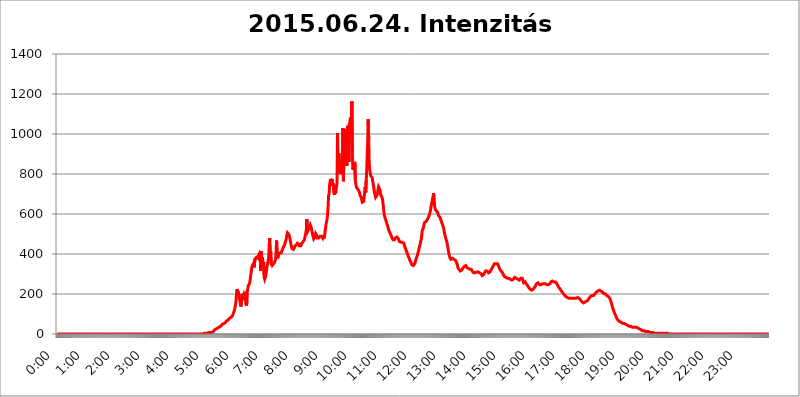
| Category | 2015.06.24. Intenzitás [W/m^2] |
|---|---|
| 0.0 | 0 |
| 0.0006944444444444445 | 0 |
| 0.001388888888888889 | 0 |
| 0.0020833333333333333 | 0 |
| 0.002777777777777778 | 0 |
| 0.003472222222222222 | 0 |
| 0.004166666666666667 | 0 |
| 0.004861111111111111 | 0 |
| 0.005555555555555556 | 0 |
| 0.0062499999999999995 | 0 |
| 0.006944444444444444 | 0 |
| 0.007638888888888889 | 0 |
| 0.008333333333333333 | 0 |
| 0.009027777777777779 | 0 |
| 0.009722222222222222 | 0 |
| 0.010416666666666666 | 0 |
| 0.011111111111111112 | 0 |
| 0.011805555555555555 | 0 |
| 0.012499999999999999 | 0 |
| 0.013194444444444444 | 0 |
| 0.013888888888888888 | 0 |
| 0.014583333333333332 | 0 |
| 0.015277777777777777 | 0 |
| 0.015972222222222224 | 0 |
| 0.016666666666666666 | 0 |
| 0.017361111111111112 | 0 |
| 0.018055555555555557 | 0 |
| 0.01875 | 0 |
| 0.019444444444444445 | 0 |
| 0.02013888888888889 | 0 |
| 0.020833333333333332 | 0 |
| 0.02152777777777778 | 0 |
| 0.022222222222222223 | 0 |
| 0.02291666666666667 | 0 |
| 0.02361111111111111 | 0 |
| 0.024305555555555556 | 0 |
| 0.024999999999999998 | 0 |
| 0.025694444444444447 | 0 |
| 0.02638888888888889 | 0 |
| 0.027083333333333334 | 0 |
| 0.027777777777777776 | 0 |
| 0.02847222222222222 | 0 |
| 0.029166666666666664 | 0 |
| 0.029861111111111113 | 0 |
| 0.030555555555555555 | 0 |
| 0.03125 | 0 |
| 0.03194444444444445 | 0 |
| 0.03263888888888889 | 0 |
| 0.03333333333333333 | 0 |
| 0.034027777777777775 | 0 |
| 0.034722222222222224 | 0 |
| 0.035416666666666666 | 0 |
| 0.036111111111111115 | 0 |
| 0.03680555555555556 | 0 |
| 0.0375 | 0 |
| 0.03819444444444444 | 0 |
| 0.03888888888888889 | 0 |
| 0.03958333333333333 | 0 |
| 0.04027777777777778 | 0 |
| 0.04097222222222222 | 0 |
| 0.041666666666666664 | 0 |
| 0.042361111111111106 | 0 |
| 0.04305555555555556 | 0 |
| 0.043750000000000004 | 0 |
| 0.044444444444444446 | 0 |
| 0.04513888888888889 | 0 |
| 0.04583333333333334 | 0 |
| 0.04652777777777778 | 0 |
| 0.04722222222222222 | 0 |
| 0.04791666666666666 | 0 |
| 0.04861111111111111 | 0 |
| 0.049305555555555554 | 0 |
| 0.049999999999999996 | 0 |
| 0.05069444444444445 | 0 |
| 0.051388888888888894 | 0 |
| 0.052083333333333336 | 0 |
| 0.05277777777777778 | 0 |
| 0.05347222222222222 | 0 |
| 0.05416666666666667 | 0 |
| 0.05486111111111111 | 0 |
| 0.05555555555555555 | 0 |
| 0.05625 | 0 |
| 0.05694444444444444 | 0 |
| 0.057638888888888885 | 0 |
| 0.05833333333333333 | 0 |
| 0.05902777777777778 | 0 |
| 0.059722222222222225 | 0 |
| 0.06041666666666667 | 0 |
| 0.061111111111111116 | 0 |
| 0.06180555555555556 | 0 |
| 0.0625 | 0 |
| 0.06319444444444444 | 0 |
| 0.06388888888888888 | 0 |
| 0.06458333333333334 | 0 |
| 0.06527777777777778 | 0 |
| 0.06597222222222222 | 0 |
| 0.06666666666666667 | 0 |
| 0.06736111111111111 | 0 |
| 0.06805555555555555 | 0 |
| 0.06874999999999999 | 0 |
| 0.06944444444444443 | 0 |
| 0.07013888888888889 | 0 |
| 0.07083333333333333 | 0 |
| 0.07152777777777779 | 0 |
| 0.07222222222222223 | 0 |
| 0.07291666666666667 | 0 |
| 0.07361111111111111 | 0 |
| 0.07430555555555556 | 0 |
| 0.075 | 0 |
| 0.07569444444444444 | 0 |
| 0.0763888888888889 | 0 |
| 0.07708333333333334 | 0 |
| 0.07777777777777778 | 0 |
| 0.07847222222222222 | 0 |
| 0.07916666666666666 | 0 |
| 0.0798611111111111 | 0 |
| 0.08055555555555556 | 0 |
| 0.08125 | 0 |
| 0.08194444444444444 | 0 |
| 0.08263888888888889 | 0 |
| 0.08333333333333333 | 0 |
| 0.08402777777777777 | 0 |
| 0.08472222222222221 | 0 |
| 0.08541666666666665 | 0 |
| 0.08611111111111112 | 0 |
| 0.08680555555555557 | 0 |
| 0.08750000000000001 | 0 |
| 0.08819444444444445 | 0 |
| 0.08888888888888889 | 0 |
| 0.08958333333333333 | 0 |
| 0.09027777777777778 | 0 |
| 0.09097222222222222 | 0 |
| 0.09166666666666667 | 0 |
| 0.09236111111111112 | 0 |
| 0.09305555555555556 | 0 |
| 0.09375 | 0 |
| 0.09444444444444444 | 0 |
| 0.09513888888888888 | 0 |
| 0.09583333333333333 | 0 |
| 0.09652777777777777 | 0 |
| 0.09722222222222222 | 0 |
| 0.09791666666666667 | 0 |
| 0.09861111111111111 | 0 |
| 0.09930555555555555 | 0 |
| 0.09999999999999999 | 0 |
| 0.10069444444444443 | 0 |
| 0.1013888888888889 | 0 |
| 0.10208333333333335 | 0 |
| 0.10277777777777779 | 0 |
| 0.10347222222222223 | 0 |
| 0.10416666666666667 | 0 |
| 0.10486111111111111 | 0 |
| 0.10555555555555556 | 0 |
| 0.10625 | 0 |
| 0.10694444444444444 | 0 |
| 0.1076388888888889 | 0 |
| 0.10833333333333334 | 0 |
| 0.10902777777777778 | 0 |
| 0.10972222222222222 | 0 |
| 0.1111111111111111 | 0 |
| 0.11180555555555556 | 0 |
| 0.11180555555555556 | 0 |
| 0.1125 | 0 |
| 0.11319444444444444 | 0 |
| 0.11388888888888889 | 0 |
| 0.11458333333333333 | 0 |
| 0.11527777777777777 | 0 |
| 0.11597222222222221 | 0 |
| 0.11666666666666665 | 0 |
| 0.1173611111111111 | 0 |
| 0.11805555555555557 | 0 |
| 0.11944444444444445 | 0 |
| 0.12013888888888889 | 0 |
| 0.12083333333333333 | 0 |
| 0.12152777777777778 | 0 |
| 0.12222222222222223 | 0 |
| 0.12291666666666667 | 0 |
| 0.12291666666666667 | 0 |
| 0.12361111111111112 | 0 |
| 0.12430555555555556 | 0 |
| 0.125 | 0 |
| 0.12569444444444444 | 0 |
| 0.12638888888888888 | 0 |
| 0.12708333333333333 | 0 |
| 0.16875 | 0 |
| 0.12847222222222224 | 0 |
| 0.12916666666666668 | 0 |
| 0.12986111111111112 | 0 |
| 0.13055555555555556 | 0 |
| 0.13125 | 0 |
| 0.13194444444444445 | 0 |
| 0.1326388888888889 | 0 |
| 0.13333333333333333 | 0 |
| 0.13402777777777777 | 0 |
| 0.13402777777777777 | 0 |
| 0.13472222222222222 | 0 |
| 0.13541666666666666 | 0 |
| 0.1361111111111111 | 0 |
| 0.13749999999999998 | 0 |
| 0.13819444444444443 | 0 |
| 0.1388888888888889 | 0 |
| 0.13958333333333334 | 0 |
| 0.14027777777777778 | 0 |
| 0.14097222222222222 | 0 |
| 0.14166666666666666 | 0 |
| 0.1423611111111111 | 0 |
| 0.14305555555555557 | 0 |
| 0.14375000000000002 | 0 |
| 0.14444444444444446 | 0 |
| 0.1451388888888889 | 0 |
| 0.1451388888888889 | 0 |
| 0.14652777777777778 | 0 |
| 0.14722222222222223 | 0 |
| 0.14791666666666667 | 0 |
| 0.1486111111111111 | 0 |
| 0.14930555555555555 | 0 |
| 0.15 | 0 |
| 0.15069444444444444 | 0 |
| 0.15138888888888888 | 0 |
| 0.15208333333333332 | 0 |
| 0.15277777777777776 | 0 |
| 0.15347222222222223 | 0 |
| 0.15416666666666667 | 0 |
| 0.15486111111111112 | 0 |
| 0.15555555555555556 | 0 |
| 0.15625 | 0 |
| 0.15694444444444444 | 0 |
| 0.15763888888888888 | 0 |
| 0.15833333333333333 | 0 |
| 0.15902777777777777 | 0 |
| 0.15972222222222224 | 0 |
| 0.16041666666666668 | 0 |
| 0.16111111111111112 | 0 |
| 0.16180555555555556 | 0 |
| 0.1625 | 0 |
| 0.16319444444444445 | 0 |
| 0.1638888888888889 | 0 |
| 0.16458333333333333 | 0 |
| 0.16527777777777777 | 0 |
| 0.16597222222222222 | 0 |
| 0.16666666666666666 | 0 |
| 0.1673611111111111 | 0 |
| 0.16805555555555554 | 0 |
| 0.16874999999999998 | 0 |
| 0.16944444444444443 | 0 |
| 0.17013888888888887 | 0 |
| 0.1708333333333333 | 0 |
| 0.17152777777777775 | 0 |
| 0.17222222222222225 | 0 |
| 0.1729166666666667 | 0 |
| 0.17361111111111113 | 0 |
| 0.17430555555555557 | 0 |
| 0.17500000000000002 | 0 |
| 0.17569444444444446 | 0 |
| 0.1763888888888889 | 0 |
| 0.17708333333333334 | 0 |
| 0.17777777777777778 | 0 |
| 0.17847222222222223 | 0 |
| 0.17916666666666667 | 0 |
| 0.1798611111111111 | 0 |
| 0.18055555555555555 | 0 |
| 0.18125 | 0 |
| 0.18194444444444444 | 0 |
| 0.1826388888888889 | 0 |
| 0.18333333333333335 | 0 |
| 0.1840277777777778 | 0 |
| 0.18472222222222223 | 0 |
| 0.18541666666666667 | 0 |
| 0.18611111111111112 | 0 |
| 0.18680555555555556 | 0 |
| 0.1875 | 0 |
| 0.18819444444444444 | 0 |
| 0.18888888888888888 | 0 |
| 0.18958333333333333 | 0 |
| 0.19027777777777777 | 0 |
| 0.1909722222222222 | 0 |
| 0.19166666666666665 | 0 |
| 0.19236111111111112 | 0 |
| 0.19305555555555554 | 0 |
| 0.19375 | 0 |
| 0.19444444444444445 | 0 |
| 0.1951388888888889 | 0 |
| 0.19583333333333333 | 0 |
| 0.19652777777777777 | 0 |
| 0.19722222222222222 | 0 |
| 0.19791666666666666 | 0 |
| 0.1986111111111111 | 0 |
| 0.19930555555555554 | 0 |
| 0.19999999999999998 | 0 |
| 0.20069444444444443 | 0 |
| 0.20138888888888887 | 0 |
| 0.2020833333333333 | 0 |
| 0.2027777777777778 | 0 |
| 0.2034722222222222 | 0 |
| 0.2041666666666667 | 0 |
| 0.20486111111111113 | 3.525 |
| 0.20555555555555557 | 3.525 |
| 0.20625000000000002 | 3.525 |
| 0.20694444444444446 | 3.525 |
| 0.2076388888888889 | 3.525 |
| 0.20833333333333334 | 3.525 |
| 0.20902777777777778 | 3.525 |
| 0.20972222222222223 | 3.525 |
| 0.21041666666666667 | 3.525 |
| 0.2111111111111111 | 3.525 |
| 0.21180555555555555 | 3.525 |
| 0.2125 | 7.887 |
| 0.21319444444444444 | 7.887 |
| 0.2138888888888889 | 7.887 |
| 0.21458333333333335 | 7.887 |
| 0.2152777777777778 | 7.887 |
| 0.21597222222222223 | 7.887 |
| 0.21666666666666667 | 7.887 |
| 0.21736111111111112 | 12.257 |
| 0.21805555555555556 | 12.257 |
| 0.21875 | 12.257 |
| 0.21944444444444444 | 12.257 |
| 0.22013888888888888 | 16.636 |
| 0.22083333333333333 | 21.024 |
| 0.22152777777777777 | 21.024 |
| 0.2222222222222222 | 21.024 |
| 0.22291666666666665 | 25.419 |
| 0.2236111111111111 | 25.419 |
| 0.22430555555555556 | 29.823 |
| 0.225 | 29.823 |
| 0.22569444444444445 | 29.823 |
| 0.2263888888888889 | 34.234 |
| 0.22708333333333333 | 34.234 |
| 0.22777777777777777 | 34.234 |
| 0.22847222222222222 | 38.653 |
| 0.22916666666666666 | 38.653 |
| 0.2298611111111111 | 43.079 |
| 0.23055555555555554 | 43.079 |
| 0.23124999999999998 | 47.511 |
| 0.23194444444444443 | 47.511 |
| 0.23263888888888887 | 47.511 |
| 0.2333333333333333 | 51.951 |
| 0.2340277777777778 | 51.951 |
| 0.2347222222222222 | 56.398 |
| 0.2354166666666667 | 56.398 |
| 0.23611111111111113 | 56.398 |
| 0.23680555555555557 | 60.85 |
| 0.23750000000000002 | 65.31 |
| 0.23819444444444446 | 65.31 |
| 0.2388888888888889 | 65.31 |
| 0.23958333333333334 | 69.775 |
| 0.24027777777777778 | 74.246 |
| 0.24097222222222223 | 74.246 |
| 0.24166666666666667 | 78.722 |
| 0.2423611111111111 | 78.722 |
| 0.24305555555555555 | 83.205 |
| 0.24375 | 83.205 |
| 0.24444444444444446 | 83.205 |
| 0.24513888888888888 | 87.692 |
| 0.24583333333333335 | 92.184 |
| 0.2465277777777778 | 96.682 |
| 0.24722222222222223 | 105.69 |
| 0.24791666666666667 | 110.201 |
| 0.24861111111111112 | 119.235 |
| 0.24930555555555556 | 132.814 |
| 0.25 | 146.423 |
| 0.25069444444444444 | 164.605 |
| 0.2513888888888889 | 196.497 |
| 0.2520833333333333 | 223.873 |
| 0.25277777777777777 | 219.309 |
| 0.2534722222222222 | 223.873 |
| 0.25416666666666665 | 205.62 |
| 0.2548611111111111 | 191.937 |
| 0.2555555555555556 | 178.264 |
| 0.25625000000000003 | 164.605 |
| 0.2569444444444445 | 150.964 |
| 0.2576388888888889 | 137.347 |
| 0.25833333333333336 | 164.605 |
| 0.2590277777777778 | 201.058 |
| 0.25972222222222224 | 191.937 |
| 0.2604166666666667 | 169.156 |
| 0.2611111111111111 | 187.378 |
| 0.26180555555555557 | 196.497 |
| 0.2625 | 187.378 |
| 0.26319444444444445 | 187.378 |
| 0.2638888888888889 | 196.497 |
| 0.26458333333333334 | 150.964 |
| 0.2652777777777778 | 141.884 |
| 0.2659722222222222 | 155.509 |
| 0.26666666666666666 | 214.746 |
| 0.2673611111111111 | 228.436 |
| 0.26805555555555555 | 242.127 |
| 0.26875 | 246.689 |
| 0.26944444444444443 | 251.251 |
| 0.2701388888888889 | 260.373 |
| 0.2708333333333333 | 278.603 |
| 0.27152777777777776 | 296.808 |
| 0.2722222222222222 | 314.98 |
| 0.27291666666666664 | 333.113 |
| 0.2736111111111111 | 342.162 |
| 0.2743055555555555 | 342.162 |
| 0.27499999999999997 | 346.682 |
| 0.27569444444444446 | 355.712 |
| 0.27638888888888885 | 333.113 |
| 0.27708333333333335 | 373.729 |
| 0.2777777777777778 | 378.224 |
| 0.27847222222222223 | 378.224 |
| 0.2791666666666667 | 382.715 |
| 0.2798611111111111 | 382.715 |
| 0.28055555555555556 | 387.202 |
| 0.28125 | 378.224 |
| 0.28194444444444444 | 391.685 |
| 0.2826388888888889 | 387.202 |
| 0.2833333333333333 | 400.638 |
| 0.28402777777777777 | 396.164 |
| 0.2847222222222222 | 373.729 |
| 0.28541666666666665 | 314.98 |
| 0.28611111111111115 | 414.035 |
| 0.28680555555555554 | 337.639 |
| 0.28750000000000003 | 382.715 |
| 0.2881944444444445 | 369.23 |
| 0.2888888888888889 | 346.682 |
| 0.28958333333333336 | 360.221 |
| 0.2902777777777778 | 283.156 |
| 0.29097222222222224 | 274.047 |
| 0.2916666666666667 | 278.603 |
| 0.2923611111111111 | 287.709 |
| 0.29305555555555557 | 305.898 |
| 0.29375 | 324.052 |
| 0.29444444444444445 | 342.162 |
| 0.2951388888888889 | 351.198 |
| 0.29583333333333334 | 369.23 |
| 0.2965277777777778 | 382.715 |
| 0.2972222222222222 | 378.224 |
| 0.29791666666666666 | 480.356 |
| 0.2986111111111111 | 400.638 |
| 0.29930555555555555 | 414.035 |
| 0.3 | 351.198 |
| 0.30069444444444443 | 346.682 |
| 0.3013888888888889 | 342.162 |
| 0.3020833333333333 | 342.162 |
| 0.30277777777777776 | 346.682 |
| 0.3034722222222222 | 351.198 |
| 0.30416666666666664 | 351.198 |
| 0.3048611111111111 | 360.221 |
| 0.3055555555555555 | 360.221 |
| 0.30624999999999997 | 373.729 |
| 0.3069444444444444 | 409.574 |
| 0.3076388888888889 | 467.187 |
| 0.30833333333333335 | 405.108 |
| 0.3090277777777778 | 378.224 |
| 0.30972222222222223 | 382.715 |
| 0.3104166666666667 | 396.164 |
| 0.3111111111111111 | 400.638 |
| 0.31180555555555556 | 405.108 |
| 0.3125 | 405.108 |
| 0.31319444444444444 | 400.638 |
| 0.3138888888888889 | 405.108 |
| 0.3145833333333333 | 409.574 |
| 0.31527777777777777 | 409.574 |
| 0.3159722222222222 | 422.943 |
| 0.31666666666666665 | 427.39 |
| 0.31736111111111115 | 436.27 |
| 0.31805555555555554 | 440.702 |
| 0.31875000000000003 | 445.129 |
| 0.3194444444444445 | 453.968 |
| 0.3201388888888889 | 462.786 |
| 0.32083333333333336 | 471.582 |
| 0.3215277777777778 | 480.356 |
| 0.32222222222222224 | 497.836 |
| 0.3229166666666667 | 506.542 |
| 0.3236111111111111 | 510.885 |
| 0.32430555555555557 | 506.542 |
| 0.325 | 497.836 |
| 0.32569444444444445 | 489.108 |
| 0.3263888888888889 | 475.972 |
| 0.32708333333333334 | 462.786 |
| 0.3277777777777778 | 449.551 |
| 0.3284722222222222 | 436.27 |
| 0.32916666666666666 | 427.39 |
| 0.3298611111111111 | 422.943 |
| 0.33055555555555555 | 422.943 |
| 0.33125 | 422.943 |
| 0.33194444444444443 | 427.39 |
| 0.3326388888888889 | 431.833 |
| 0.3333333333333333 | 440.702 |
| 0.3340277777777778 | 440.702 |
| 0.3347222222222222 | 445.129 |
| 0.3354166666666667 | 445.129 |
| 0.3361111111111111 | 449.551 |
| 0.3368055555555556 | 453.968 |
| 0.33749999999999997 | 458.38 |
| 0.33819444444444446 | 453.968 |
| 0.33888888888888885 | 449.551 |
| 0.33958333333333335 | 440.702 |
| 0.34027777777777773 | 436.27 |
| 0.34097222222222223 | 436.27 |
| 0.3416666666666666 | 440.702 |
| 0.3423611111111111 | 445.129 |
| 0.3430555555555555 | 453.968 |
| 0.34375 | 458.38 |
| 0.3444444444444445 | 458.38 |
| 0.3451388888888889 | 462.786 |
| 0.3458333333333334 | 467.187 |
| 0.34652777777777777 | 471.582 |
| 0.34722222222222227 | 480.356 |
| 0.34791666666666665 | 493.475 |
| 0.34861111111111115 | 506.542 |
| 0.34930555555555554 | 519.555 |
| 0.35000000000000003 | 575.299 |
| 0.3506944444444444 | 528.2 |
| 0.3513888888888889 | 515.223 |
| 0.3520833333333333 | 510.885 |
| 0.3527777777777778 | 515.223 |
| 0.3534722222222222 | 532.513 |
| 0.3541666666666667 | 536.82 |
| 0.3548611111111111 | 545.416 |
| 0.35555555555555557 | 541.121 |
| 0.35625 | 532.513 |
| 0.35694444444444445 | 519.555 |
| 0.3576388888888889 | 506.542 |
| 0.35833333333333334 | 493.475 |
| 0.3590277777777778 | 484.735 |
| 0.3597222222222222 | 475.972 |
| 0.36041666666666666 | 471.582 |
| 0.3611111111111111 | 475.972 |
| 0.36180555555555555 | 489.108 |
| 0.3625 | 502.192 |
| 0.36319444444444443 | 506.542 |
| 0.3638888888888889 | 493.475 |
| 0.3645833333333333 | 480.356 |
| 0.3652777777777778 | 475.972 |
| 0.3659722222222222 | 480.356 |
| 0.3666666666666667 | 480.356 |
| 0.3673611111111111 | 484.735 |
| 0.3680555555555556 | 484.735 |
| 0.36874999999999997 | 489.108 |
| 0.36944444444444446 | 489.108 |
| 0.37013888888888885 | 489.108 |
| 0.37083333333333335 | 489.108 |
| 0.37152777777777773 | 489.108 |
| 0.37222222222222223 | 480.356 |
| 0.3729166666666666 | 489.108 |
| 0.3736111111111111 | 475.972 |
| 0.3743055555555555 | 480.356 |
| 0.375 | 493.475 |
| 0.3756944444444445 | 515.223 |
| 0.3763888888888889 | 532.513 |
| 0.3770833333333334 | 549.704 |
| 0.37777777777777777 | 562.53 |
| 0.37847222222222227 | 575.299 |
| 0.37916666666666665 | 600.661 |
| 0.37986111111111115 | 634.105 |
| 0.38055555555555554 | 691.608 |
| 0.38125000000000003 | 699.717 |
| 0.3819444444444444 | 743.859 |
| 0.3826388888888889 | 747.834 |
| 0.3833333333333333 | 775.492 |
| 0.3840277777777778 | 759.723 |
| 0.3847222222222222 | 739.877 |
| 0.3854166666666667 | 775.492 |
| 0.3861111111111111 | 755.766 |
| 0.38680555555555557 | 739.877 |
| 0.3875 | 751.803 |
| 0.38819444444444445 | 703.762 |
| 0.3888888888888889 | 695.666 |
| 0.38958333333333334 | 731.896 |
| 0.3902777777777778 | 703.762 |
| 0.3909722222222222 | 719.877 |
| 0.39166666666666666 | 735.89 |
| 0.3923611111111111 | 751.803 |
| 0.39305555555555555 | 1003.65 |
| 0.39375 | 806.757 |
| 0.39444444444444443 | 864.493 |
| 0.3951388888888889 | 902.447 |
| 0.3958333333333333 | 841.526 |
| 0.3965277777777778 | 798.974 |
| 0.3972222222222222 | 795.074 |
| 0.3979166666666667 | 818.392 |
| 0.3986111111111111 | 822.26 |
| 0.3993055555555556 | 837.682 |
| 0.39999999999999997 | 810.641 |
| 0.40069444444444446 | 1029.798 |
| 0.40138888888888885 | 763.674 |
| 0.40208333333333335 | 902.447 |
| 0.40277777777777773 | 1022.323 |
| 0.40347222222222223 | 1014.852 |
| 0.4041666666666666 | 988.714 |
| 0.4048611111111111 | 955.071 |
| 0.4055555555555555 | 868.305 |
| 0.40625 | 841.526 |
| 0.4069444444444445 | 1029.798 |
| 0.4076388888888889 | 1041.019 |
| 0.4083333333333334 | 973.772 |
| 0.40902777777777777 | 860.676 |
| 0.40972222222222227 | 1048.508 |
| 0.41041666666666665 | 1056.004 |
| 0.41111111111111115 | 1082.324 |
| 0.41180555555555554 | 1063.51 |
| 0.41250000000000003 | 992.448 |
| 0.4131944444444444 | 1162.571 |
| 0.4138888888888889 | 909.996 |
| 0.4145833333333333 | 822.26 |
| 0.4152777777777778 | 833.834 |
| 0.4159722222222222 | 822.26 |
| 0.4166666666666667 | 845.365 |
| 0.4173611111111111 | 860.676 |
| 0.41805555555555557 | 767.62 |
| 0.41875 | 751.803 |
| 0.41944444444444445 | 735.89 |
| 0.4201388888888889 | 731.896 |
| 0.42083333333333334 | 727.896 |
| 0.4215277777777778 | 723.889 |
| 0.4222222222222222 | 719.877 |
| 0.42291666666666666 | 719.877 |
| 0.4236111111111111 | 711.832 |
| 0.42430555555555555 | 699.717 |
| 0.425 | 691.608 |
| 0.42569444444444443 | 687.544 |
| 0.4263888888888889 | 683.473 |
| 0.4270833333333333 | 671.22 |
| 0.4277777777777778 | 658.909 |
| 0.4284722222222222 | 654.791 |
| 0.4291666666666667 | 658.909 |
| 0.4298611111111111 | 663.019 |
| 0.4305555555555556 | 687.544 |
| 0.43124999999999997 | 687.544 |
| 0.43194444444444446 | 735.89 |
| 0.43263888888888885 | 707.8 |
| 0.43333333333333335 | 767.62 |
| 0.43402777777777773 | 814.519 |
| 0.43472222222222223 | 894.885 |
| 0.4354166666666666 | 970.034 |
| 0.4361111111111111 | 1074.789 |
| 0.4368055555555555 | 981.244 |
| 0.4375 | 856.855 |
| 0.4381944444444445 | 822.26 |
| 0.4388888888888889 | 806.757 |
| 0.4395833333333334 | 791.169 |
| 0.44027777777777777 | 787.258 |
| 0.44097222222222227 | 787.258 |
| 0.44166666666666665 | 783.342 |
| 0.44236111111111115 | 767.62 |
| 0.44305555555555554 | 751.803 |
| 0.44375000000000003 | 735.89 |
| 0.4444444444444444 | 719.877 |
| 0.4451388888888889 | 703.762 |
| 0.4458333333333333 | 691.608 |
| 0.4465277777777778 | 683.473 |
| 0.4472222222222222 | 679.395 |
| 0.4479166666666667 | 683.473 |
| 0.4486111111111111 | 695.666 |
| 0.44930555555555557 | 707.8 |
| 0.45 | 723.889 |
| 0.45069444444444445 | 735.89 |
| 0.4513888888888889 | 739.877 |
| 0.45208333333333334 | 735.89 |
| 0.4527777777777778 | 719.877 |
| 0.4534722222222222 | 699.717 |
| 0.45416666666666666 | 691.608 |
| 0.4548611111111111 | 691.608 |
| 0.45555555555555555 | 683.473 |
| 0.45625 | 671.22 |
| 0.45694444444444443 | 650.667 |
| 0.4576388888888889 | 625.784 |
| 0.4583333333333333 | 604.864 |
| 0.4590277777777778 | 592.233 |
| 0.4597222222222222 | 579.542 |
| 0.4604166666666667 | 575.299 |
| 0.4611111111111111 | 566.793 |
| 0.4618055555555556 | 558.261 |
| 0.46249999999999997 | 549.704 |
| 0.46319444444444446 | 541.121 |
| 0.46388888888888885 | 532.513 |
| 0.46458333333333335 | 523.88 |
| 0.46527777777777773 | 515.223 |
| 0.46597222222222223 | 510.885 |
| 0.4666666666666666 | 506.542 |
| 0.4673611111111111 | 497.836 |
| 0.4680555555555555 | 493.475 |
| 0.46875 | 489.108 |
| 0.4694444444444445 | 480.356 |
| 0.4701388888888889 | 475.972 |
| 0.4708333333333334 | 471.582 |
| 0.47152777777777777 | 467.187 |
| 0.47222222222222227 | 467.187 |
| 0.47291666666666665 | 471.582 |
| 0.47361111111111115 | 471.582 |
| 0.47430555555555554 | 480.356 |
| 0.47500000000000003 | 484.735 |
| 0.4756944444444444 | 484.735 |
| 0.4763888888888889 | 484.735 |
| 0.4770833333333333 | 484.735 |
| 0.4777777777777778 | 480.356 |
| 0.4784722222222222 | 475.972 |
| 0.4791666666666667 | 471.582 |
| 0.4798611111111111 | 462.786 |
| 0.48055555555555557 | 458.38 |
| 0.48125 | 458.38 |
| 0.48194444444444445 | 458.38 |
| 0.4826388888888889 | 458.38 |
| 0.48333333333333334 | 458.38 |
| 0.4840277777777778 | 458.38 |
| 0.4847222222222222 | 453.968 |
| 0.48541666666666666 | 453.968 |
| 0.4861111111111111 | 453.968 |
| 0.48680555555555555 | 445.129 |
| 0.4875 | 436.27 |
| 0.48819444444444443 | 431.833 |
| 0.4888888888888889 | 422.943 |
| 0.4895833333333333 | 418.492 |
| 0.4902777777777778 | 409.574 |
| 0.4909722222222222 | 405.108 |
| 0.4916666666666667 | 396.164 |
| 0.4923611111111111 | 387.202 |
| 0.4930555555555556 | 382.715 |
| 0.49374999999999997 | 378.224 |
| 0.49444444444444446 | 369.23 |
| 0.49513888888888885 | 369.23 |
| 0.49583333333333335 | 360.221 |
| 0.49652777777777773 | 355.712 |
| 0.49722222222222223 | 346.682 |
| 0.4979166666666666 | 342.162 |
| 0.4986111111111111 | 342.162 |
| 0.4993055555555555 | 342.162 |
| 0.5 | 342.162 |
| 0.5006944444444444 | 342.162 |
| 0.5013888888888889 | 351.198 |
| 0.5020833333333333 | 360.221 |
| 0.5027777777777778 | 364.728 |
| 0.5034722222222222 | 378.224 |
| 0.5041666666666667 | 382.715 |
| 0.5048611111111111 | 391.685 |
| 0.5055555555555555 | 400.638 |
| 0.50625 | 409.574 |
| 0.5069444444444444 | 418.492 |
| 0.5076388888888889 | 431.833 |
| 0.5083333333333333 | 440.702 |
| 0.5090277777777777 | 449.551 |
| 0.5097222222222222 | 462.786 |
| 0.5104166666666666 | 471.582 |
| 0.5111111111111112 | 489.108 |
| 0.5118055555555555 | 515.223 |
| 0.5125000000000001 | 519.555 |
| 0.5131944444444444 | 528.2 |
| 0.513888888888889 | 536.82 |
| 0.5145833333333333 | 549.704 |
| 0.5152777777777778 | 558.261 |
| 0.5159722222222222 | 558.261 |
| 0.5166666666666667 | 558.261 |
| 0.517361111111111 | 562.53 |
| 0.5180555555555556 | 566.793 |
| 0.5187499999999999 | 571.049 |
| 0.5194444444444445 | 575.299 |
| 0.5201388888888888 | 579.542 |
| 0.5208333333333334 | 583.779 |
| 0.5215277777777778 | 592.233 |
| 0.5222222222222223 | 596.45 |
| 0.5229166666666667 | 609.062 |
| 0.5236111111111111 | 621.613 |
| 0.5243055555555556 | 638.256 |
| 0.525 | 650.667 |
| 0.5256944444444445 | 663.019 |
| 0.5263888888888889 | 675.311 |
| 0.5270833333333333 | 687.544 |
| 0.5277777777777778 | 703.762 |
| 0.5284722222222222 | 687.544 |
| 0.5291666666666667 | 646.537 |
| 0.5298611111111111 | 625.784 |
| 0.5305555555555556 | 621.613 |
| 0.53125 | 617.436 |
| 0.5319444444444444 | 613.252 |
| 0.5326388888888889 | 613.252 |
| 0.5333333333333333 | 609.062 |
| 0.5340277777777778 | 600.661 |
| 0.5347222222222222 | 592.233 |
| 0.5354166666666667 | 588.009 |
| 0.5361111111111111 | 588.009 |
| 0.5368055555555555 | 583.779 |
| 0.5375 | 575.299 |
| 0.5381944444444444 | 571.049 |
| 0.5388888888888889 | 562.53 |
| 0.5395833333333333 | 553.986 |
| 0.5402777777777777 | 549.704 |
| 0.5409722222222222 | 541.121 |
| 0.5416666666666666 | 532.513 |
| 0.5423611111111112 | 519.555 |
| 0.5430555555555555 | 506.542 |
| 0.5437500000000001 | 493.475 |
| 0.5444444444444444 | 484.735 |
| 0.545138888888889 | 475.972 |
| 0.5458333333333333 | 467.187 |
| 0.5465277777777778 | 458.38 |
| 0.5472222222222222 | 445.129 |
| 0.5479166666666667 | 431.833 |
| 0.548611111111111 | 414.035 |
| 0.5493055555555556 | 400.638 |
| 0.5499999999999999 | 391.685 |
| 0.5506944444444445 | 382.715 |
| 0.5513888888888888 | 378.224 |
| 0.5520833333333334 | 373.729 |
| 0.5527777777777778 | 378.224 |
| 0.5534722222222223 | 378.224 |
| 0.5541666666666667 | 378.224 |
| 0.5548611111111111 | 378.224 |
| 0.5555555555555556 | 373.729 |
| 0.55625 | 373.729 |
| 0.5569444444444445 | 373.729 |
| 0.5576388888888889 | 373.729 |
| 0.5583333333333333 | 369.23 |
| 0.5590277777777778 | 364.728 |
| 0.5597222222222222 | 360.221 |
| 0.5604166666666667 | 355.712 |
| 0.5611111111111111 | 346.682 |
| 0.5618055555555556 | 333.113 |
| 0.5625 | 328.584 |
| 0.5631944444444444 | 324.052 |
| 0.5638888888888889 | 319.517 |
| 0.5645833333333333 | 319.517 |
| 0.5652777777777778 | 314.98 |
| 0.5659722222222222 | 314.98 |
| 0.5666666666666667 | 319.517 |
| 0.5673611111111111 | 319.517 |
| 0.5680555555555555 | 324.052 |
| 0.56875 | 328.584 |
| 0.5694444444444444 | 333.113 |
| 0.5701388888888889 | 333.113 |
| 0.5708333333333333 | 337.639 |
| 0.5715277777777777 | 342.162 |
| 0.5722222222222222 | 342.162 |
| 0.5729166666666666 | 342.162 |
| 0.5736111111111112 | 337.639 |
| 0.5743055555555555 | 333.113 |
| 0.5750000000000001 | 333.113 |
| 0.5756944444444444 | 333.113 |
| 0.576388888888889 | 328.584 |
| 0.5770833333333333 | 324.052 |
| 0.5777777777777778 | 324.052 |
| 0.5784722222222222 | 324.052 |
| 0.5791666666666667 | 324.052 |
| 0.579861111111111 | 324.052 |
| 0.5805555555555556 | 324.052 |
| 0.5812499999999999 | 319.517 |
| 0.5819444444444445 | 314.98 |
| 0.5826388888888888 | 310.44 |
| 0.5833333333333334 | 310.44 |
| 0.5840277777777778 | 305.898 |
| 0.5847222222222223 | 305.898 |
| 0.5854166666666667 | 305.898 |
| 0.5861111111111111 | 305.898 |
| 0.5868055555555556 | 305.898 |
| 0.5875 | 305.898 |
| 0.5881944444444445 | 310.44 |
| 0.5888888888888889 | 310.44 |
| 0.5895833333333333 | 310.44 |
| 0.5902777777777778 | 310.44 |
| 0.5909722222222222 | 310.44 |
| 0.5916666666666667 | 310.44 |
| 0.5923611111111111 | 305.898 |
| 0.5930555555555556 | 305.898 |
| 0.59375 | 305.898 |
| 0.5944444444444444 | 301.354 |
| 0.5951388888888889 | 296.808 |
| 0.5958333333333333 | 292.259 |
| 0.5965277777777778 | 292.259 |
| 0.5972222222222222 | 296.808 |
| 0.5979166666666667 | 296.808 |
| 0.5986111111111111 | 296.808 |
| 0.5993055555555555 | 305.898 |
| 0.6 | 310.44 |
| 0.6006944444444444 | 314.98 |
| 0.6013888888888889 | 319.517 |
| 0.6020833333333333 | 319.517 |
| 0.6027777777777777 | 314.98 |
| 0.6034722222222222 | 310.44 |
| 0.6041666666666666 | 310.44 |
| 0.6048611111111112 | 305.898 |
| 0.6055555555555555 | 310.44 |
| 0.6062500000000001 | 310.44 |
| 0.6069444444444444 | 310.44 |
| 0.607638888888889 | 314.98 |
| 0.6083333333333333 | 319.517 |
| 0.6090277777777778 | 324.052 |
| 0.6097222222222222 | 324.052 |
| 0.6104166666666667 | 333.113 |
| 0.611111111111111 | 337.639 |
| 0.6118055555555556 | 342.162 |
| 0.6124999999999999 | 346.682 |
| 0.6131944444444445 | 351.198 |
| 0.6138888888888888 | 351.198 |
| 0.6145833333333334 | 355.712 |
| 0.6152777777777778 | 351.198 |
| 0.6159722222222223 | 351.198 |
| 0.6166666666666667 | 351.198 |
| 0.6173611111111111 | 351.198 |
| 0.6180555555555556 | 346.682 |
| 0.61875 | 342.162 |
| 0.6194444444444445 | 337.639 |
| 0.6201388888888889 | 328.584 |
| 0.6208333333333333 | 324.052 |
| 0.6215277777777778 | 319.517 |
| 0.6222222222222222 | 314.98 |
| 0.6229166666666667 | 314.98 |
| 0.6236111111111111 | 310.44 |
| 0.6243055555555556 | 305.898 |
| 0.625 | 305.898 |
| 0.6256944444444444 | 296.808 |
| 0.6263888888888889 | 292.259 |
| 0.6270833333333333 | 287.709 |
| 0.6277777777777778 | 283.156 |
| 0.6284722222222222 | 283.156 |
| 0.6291666666666667 | 283.156 |
| 0.6298611111111111 | 278.603 |
| 0.6305555555555555 | 278.603 |
| 0.63125 | 278.603 |
| 0.6319444444444444 | 278.603 |
| 0.6326388888888889 | 278.603 |
| 0.6333333333333333 | 278.603 |
| 0.6340277777777777 | 278.603 |
| 0.6347222222222222 | 274.047 |
| 0.6354166666666666 | 274.047 |
| 0.6361111111111112 | 269.49 |
| 0.6368055555555555 | 269.49 |
| 0.6375000000000001 | 269.49 |
| 0.6381944444444444 | 269.49 |
| 0.638888888888889 | 269.49 |
| 0.6395833333333333 | 274.047 |
| 0.6402777777777778 | 278.603 |
| 0.6409722222222222 | 278.603 |
| 0.6416666666666667 | 283.156 |
| 0.642361111111111 | 283.156 |
| 0.6430555555555556 | 278.603 |
| 0.6437499999999999 | 278.603 |
| 0.6444444444444445 | 278.603 |
| 0.6451388888888888 | 274.047 |
| 0.6458333333333334 | 274.047 |
| 0.6465277777777778 | 274.047 |
| 0.6472222222222223 | 269.49 |
| 0.6479166666666667 | 269.49 |
| 0.6486111111111111 | 264.932 |
| 0.6493055555555556 | 269.49 |
| 0.65 | 278.603 |
| 0.6506944444444445 | 283.156 |
| 0.6513888888888889 | 283.156 |
| 0.6520833333333333 | 278.603 |
| 0.6527777777777778 | 274.047 |
| 0.6534722222222222 | 264.932 |
| 0.6541666666666667 | 255.813 |
| 0.6548611111111111 | 255.813 |
| 0.6555555555555556 | 255.813 |
| 0.65625 | 260.373 |
| 0.6569444444444444 | 255.813 |
| 0.6576388888888889 | 251.251 |
| 0.6583333333333333 | 246.689 |
| 0.6590277777777778 | 246.689 |
| 0.6597222222222222 | 242.127 |
| 0.6604166666666667 | 237.564 |
| 0.6611111111111111 | 233 |
| 0.6618055555555555 | 228.436 |
| 0.6625 | 228.436 |
| 0.6631944444444444 | 223.873 |
| 0.6638888888888889 | 219.309 |
| 0.6645833333333333 | 219.309 |
| 0.6652777777777777 | 219.309 |
| 0.6659722222222222 | 219.309 |
| 0.6666666666666666 | 219.309 |
| 0.6673611111111111 | 223.873 |
| 0.6680555555555556 | 223.873 |
| 0.6687500000000001 | 228.436 |
| 0.6694444444444444 | 233 |
| 0.6701388888888888 | 237.564 |
| 0.6708333333333334 | 242.127 |
| 0.6715277777777778 | 246.689 |
| 0.6722222222222222 | 251.251 |
| 0.6729166666666666 | 255.813 |
| 0.6736111111111112 | 255.813 |
| 0.6743055555555556 | 255.813 |
| 0.6749999999999999 | 251.251 |
| 0.6756944444444444 | 251.251 |
| 0.6763888888888889 | 246.689 |
| 0.6770833333333334 | 246.689 |
| 0.6777777777777777 | 246.689 |
| 0.6784722222222223 | 246.689 |
| 0.6791666666666667 | 246.689 |
| 0.6798611111111111 | 251.251 |
| 0.6805555555555555 | 251.251 |
| 0.68125 | 251.251 |
| 0.6819444444444445 | 251.251 |
| 0.6826388888888889 | 251.251 |
| 0.6833333333333332 | 251.251 |
| 0.6840277777777778 | 251.251 |
| 0.6847222222222222 | 251.251 |
| 0.6854166666666667 | 251.251 |
| 0.686111111111111 | 251.251 |
| 0.6868055555555556 | 246.689 |
| 0.6875 | 246.689 |
| 0.6881944444444444 | 246.689 |
| 0.688888888888889 | 246.689 |
| 0.6895833333333333 | 246.689 |
| 0.6902777777777778 | 251.251 |
| 0.6909722222222222 | 251.251 |
| 0.6916666666666668 | 255.813 |
| 0.6923611111111111 | 260.373 |
| 0.6930555555555555 | 260.373 |
| 0.69375 | 260.373 |
| 0.6944444444444445 | 264.932 |
| 0.6951388888888889 | 264.932 |
| 0.6958333333333333 | 264.932 |
| 0.6965277777777777 | 260.373 |
| 0.6972222222222223 | 260.373 |
| 0.6979166666666666 | 260.373 |
| 0.6986111111111111 | 260.373 |
| 0.6993055555555556 | 255.813 |
| 0.7000000000000001 | 255.813 |
| 0.7006944444444444 | 251.251 |
| 0.7013888888888888 | 246.689 |
| 0.7020833333333334 | 242.127 |
| 0.7027777777777778 | 237.564 |
| 0.7034722222222222 | 233 |
| 0.7041666666666666 | 228.436 |
| 0.7048611111111112 | 228.436 |
| 0.7055555555555556 | 223.873 |
| 0.7062499999999999 | 219.309 |
| 0.7069444444444444 | 214.746 |
| 0.7076388888888889 | 210.182 |
| 0.7083333333333334 | 210.182 |
| 0.7090277777777777 | 205.62 |
| 0.7097222222222223 | 201.058 |
| 0.7104166666666667 | 201.058 |
| 0.7111111111111111 | 196.497 |
| 0.7118055555555555 | 191.937 |
| 0.7125 | 191.937 |
| 0.7131944444444445 | 187.378 |
| 0.7138888888888889 | 187.378 |
| 0.7145833333333332 | 182.82 |
| 0.7152777777777778 | 182.82 |
| 0.7159722222222222 | 178.264 |
| 0.7166666666666667 | 178.264 |
| 0.717361111111111 | 178.264 |
| 0.7180555555555556 | 178.264 |
| 0.71875 | 182.82 |
| 0.7194444444444444 | 178.264 |
| 0.720138888888889 | 178.264 |
| 0.7208333333333333 | 178.264 |
| 0.7215277777777778 | 178.264 |
| 0.7222222222222222 | 178.264 |
| 0.7229166666666668 | 178.264 |
| 0.7236111111111111 | 178.264 |
| 0.7243055555555555 | 178.264 |
| 0.725 | 178.264 |
| 0.7256944444444445 | 178.264 |
| 0.7263888888888889 | 173.709 |
| 0.7270833333333333 | 178.264 |
| 0.7277777777777777 | 178.264 |
| 0.7284722222222223 | 178.264 |
| 0.7291666666666666 | 178.264 |
| 0.7298611111111111 | 182.82 |
| 0.7305555555555556 | 178.264 |
| 0.7312500000000001 | 178.264 |
| 0.7319444444444444 | 178.264 |
| 0.7326388888888888 | 173.709 |
| 0.7333333333333334 | 173.709 |
| 0.7340277777777778 | 169.156 |
| 0.7347222222222222 | 164.605 |
| 0.7354166666666666 | 164.605 |
| 0.7361111111111112 | 160.056 |
| 0.7368055555555556 | 160.056 |
| 0.7374999999999999 | 155.509 |
| 0.7381944444444444 | 155.509 |
| 0.7388888888888889 | 155.509 |
| 0.7395833333333334 | 155.509 |
| 0.7402777777777777 | 160.056 |
| 0.7409722222222223 | 160.056 |
| 0.7416666666666667 | 160.056 |
| 0.7423611111111111 | 164.605 |
| 0.7430555555555555 | 164.605 |
| 0.74375 | 169.156 |
| 0.7444444444444445 | 169.156 |
| 0.7451388888888889 | 173.709 |
| 0.7458333333333332 | 178.264 |
| 0.7465277777777778 | 182.82 |
| 0.7472222222222222 | 182.82 |
| 0.7479166666666667 | 187.378 |
| 0.748611111111111 | 187.378 |
| 0.7493055555555556 | 187.378 |
| 0.75 | 191.937 |
| 0.7506944444444444 | 191.937 |
| 0.751388888888889 | 191.937 |
| 0.7520833333333333 | 191.937 |
| 0.7527777777777778 | 196.497 |
| 0.7534722222222222 | 196.497 |
| 0.7541666666666668 | 201.058 |
| 0.7548611111111111 | 201.058 |
| 0.7555555555555555 | 205.62 |
| 0.75625 | 210.182 |
| 0.7569444444444445 | 210.182 |
| 0.7576388888888889 | 214.746 |
| 0.7583333333333333 | 214.746 |
| 0.7590277777777777 | 219.309 |
| 0.7597222222222223 | 219.309 |
| 0.7604166666666666 | 219.309 |
| 0.7611111111111111 | 219.309 |
| 0.7618055555555556 | 219.309 |
| 0.7625000000000001 | 214.746 |
| 0.7631944444444444 | 214.746 |
| 0.7638888888888888 | 210.182 |
| 0.7645833333333334 | 210.182 |
| 0.7652777777777778 | 205.62 |
| 0.7659722222222222 | 205.62 |
| 0.7666666666666666 | 201.058 |
| 0.7673611111111112 | 201.058 |
| 0.7680555555555556 | 201.058 |
| 0.7687499999999999 | 201.058 |
| 0.7694444444444444 | 196.497 |
| 0.7701388888888889 | 196.497 |
| 0.7708333333333334 | 191.937 |
| 0.7715277777777777 | 191.937 |
| 0.7722222222222223 | 187.378 |
| 0.7729166666666667 | 187.378 |
| 0.7736111111111111 | 187.378 |
| 0.7743055555555555 | 182.82 |
| 0.775 | 178.264 |
| 0.7756944444444445 | 173.709 |
| 0.7763888888888889 | 164.605 |
| 0.7770833333333332 | 155.509 |
| 0.7777777777777778 | 146.423 |
| 0.7784722222222222 | 137.347 |
| 0.7791666666666667 | 128.284 |
| 0.779861111111111 | 123.758 |
| 0.7805555555555556 | 114.716 |
| 0.78125 | 110.201 |
| 0.7819444444444444 | 101.184 |
| 0.782638888888889 | 96.682 |
| 0.7833333333333333 | 92.184 |
| 0.7840277777777778 | 83.205 |
| 0.7847222222222222 | 78.722 |
| 0.7854166666666668 | 74.246 |
| 0.7861111111111111 | 69.775 |
| 0.7868055555555555 | 69.775 |
| 0.7875 | 65.31 |
| 0.7881944444444445 | 60.85 |
| 0.7888888888888889 | 60.85 |
| 0.7895833333333333 | 60.85 |
| 0.7902777777777777 | 60.85 |
| 0.7909722222222223 | 56.398 |
| 0.7916666666666666 | 56.398 |
| 0.7923611111111111 | 56.398 |
| 0.7930555555555556 | 56.398 |
| 0.7937500000000001 | 51.951 |
| 0.7944444444444444 | 51.951 |
| 0.7951388888888888 | 51.951 |
| 0.7958333333333334 | 51.951 |
| 0.7965277777777778 | 47.511 |
| 0.7972222222222222 | 47.511 |
| 0.7979166666666666 | 47.511 |
| 0.7986111111111112 | 47.511 |
| 0.7993055555555556 | 43.079 |
| 0.7999999999999999 | 43.079 |
| 0.8006944444444444 | 43.079 |
| 0.8013888888888889 | 38.653 |
| 0.8020833333333334 | 38.653 |
| 0.8027777777777777 | 38.653 |
| 0.8034722222222223 | 38.653 |
| 0.8041666666666667 | 38.653 |
| 0.8048611111111111 | 34.234 |
| 0.8055555555555555 | 34.234 |
| 0.80625 | 34.234 |
| 0.8069444444444445 | 34.234 |
| 0.8076388888888889 | 38.653 |
| 0.8083333333333332 | 34.234 |
| 0.8090277777777778 | 34.234 |
| 0.8097222222222222 | 34.234 |
| 0.8104166666666667 | 34.234 |
| 0.811111111111111 | 34.234 |
| 0.8118055555555556 | 34.234 |
| 0.8125 | 34.234 |
| 0.8131944444444444 | 34.234 |
| 0.813888888888889 | 29.823 |
| 0.8145833333333333 | 29.823 |
| 0.8152777777777778 | 29.823 |
| 0.8159722222222222 | 25.419 |
| 0.8166666666666668 | 25.419 |
| 0.8173611111111111 | 21.024 |
| 0.8180555555555555 | 21.024 |
| 0.81875 | 21.024 |
| 0.8194444444444445 | 21.024 |
| 0.8201388888888889 | 21.024 |
| 0.8208333333333333 | 16.636 |
| 0.8215277777777777 | 16.636 |
| 0.8222222222222223 | 16.636 |
| 0.8229166666666666 | 16.636 |
| 0.8236111111111111 | 16.636 |
| 0.8243055555555556 | 16.636 |
| 0.8250000000000001 | 12.257 |
| 0.8256944444444444 | 12.257 |
| 0.8263888888888888 | 12.257 |
| 0.8270833333333334 | 12.257 |
| 0.8277777777777778 | 12.257 |
| 0.8284722222222222 | 12.257 |
| 0.8291666666666666 | 12.257 |
| 0.8298611111111112 | 12.257 |
| 0.8305555555555556 | 7.887 |
| 0.8312499999999999 | 7.887 |
| 0.8319444444444444 | 7.887 |
| 0.8326388888888889 | 7.887 |
| 0.8333333333333334 | 7.887 |
| 0.8340277777777777 | 7.887 |
| 0.8347222222222223 | 7.887 |
| 0.8354166666666667 | 7.887 |
| 0.8361111111111111 | 7.887 |
| 0.8368055555555555 | 7.887 |
| 0.8375 | 3.525 |
| 0.8381944444444445 | 7.887 |
| 0.8388888888888889 | 3.525 |
| 0.8395833333333332 | 3.525 |
| 0.8402777777777778 | 3.525 |
| 0.8409722222222222 | 3.525 |
| 0.8416666666666667 | 3.525 |
| 0.842361111111111 | 3.525 |
| 0.8430555555555556 | 3.525 |
| 0.84375 | 3.525 |
| 0.8444444444444444 | 3.525 |
| 0.845138888888889 | 3.525 |
| 0.8458333333333333 | 3.525 |
| 0.8465277777777778 | 3.525 |
| 0.8472222222222222 | 3.525 |
| 0.8479166666666668 | 3.525 |
| 0.8486111111111111 | 3.525 |
| 0.8493055555555555 | 3.525 |
| 0.85 | 3.525 |
| 0.8506944444444445 | 3.525 |
| 0.8513888888888889 | 3.525 |
| 0.8520833333333333 | 3.525 |
| 0.8527777777777777 | 3.525 |
| 0.8534722222222223 | 3.525 |
| 0.8541666666666666 | 3.525 |
| 0.8548611111111111 | 3.525 |
| 0.8555555555555556 | 3.525 |
| 0.8562500000000001 | 3.525 |
| 0.8569444444444444 | 3.525 |
| 0.8576388888888888 | 0 |
| 0.8583333333333334 | 0 |
| 0.8590277777777778 | 0 |
| 0.8597222222222222 | 0 |
| 0.8604166666666666 | 0 |
| 0.8611111111111112 | 0 |
| 0.8618055555555556 | 0 |
| 0.8624999999999999 | 0 |
| 0.8631944444444444 | 0 |
| 0.8638888888888889 | 0 |
| 0.8645833333333334 | 0 |
| 0.8652777777777777 | 0 |
| 0.8659722222222223 | 0 |
| 0.8666666666666667 | 0 |
| 0.8673611111111111 | 0 |
| 0.8680555555555555 | 0 |
| 0.86875 | 0 |
| 0.8694444444444445 | 0 |
| 0.8701388888888889 | 0 |
| 0.8708333333333332 | 0 |
| 0.8715277777777778 | 0 |
| 0.8722222222222222 | 0 |
| 0.8729166666666667 | 0 |
| 0.873611111111111 | 0 |
| 0.8743055555555556 | 0 |
| 0.875 | 0 |
| 0.8756944444444444 | 0 |
| 0.876388888888889 | 0 |
| 0.8770833333333333 | 0 |
| 0.8777777777777778 | 0 |
| 0.8784722222222222 | 0 |
| 0.8791666666666668 | 0 |
| 0.8798611111111111 | 0 |
| 0.8805555555555555 | 0 |
| 0.88125 | 0 |
| 0.8819444444444445 | 0 |
| 0.8826388888888889 | 0 |
| 0.8833333333333333 | 0 |
| 0.8840277777777777 | 0 |
| 0.8847222222222223 | 0 |
| 0.8854166666666666 | 0 |
| 0.8861111111111111 | 0 |
| 0.8868055555555556 | 0 |
| 0.8875000000000001 | 0 |
| 0.8881944444444444 | 0 |
| 0.8888888888888888 | 0 |
| 0.8895833333333334 | 0 |
| 0.8902777777777778 | 0 |
| 0.8909722222222222 | 0 |
| 0.8916666666666666 | 0 |
| 0.8923611111111112 | 0 |
| 0.8930555555555556 | 0 |
| 0.8937499999999999 | 0 |
| 0.8944444444444444 | 0 |
| 0.8951388888888889 | 0 |
| 0.8958333333333334 | 0 |
| 0.8965277777777777 | 0 |
| 0.8972222222222223 | 0 |
| 0.8979166666666667 | 0 |
| 0.8986111111111111 | 0 |
| 0.8993055555555555 | 0 |
| 0.9 | 0 |
| 0.9006944444444445 | 0 |
| 0.9013888888888889 | 0 |
| 0.9020833333333332 | 0 |
| 0.9027777777777778 | 0 |
| 0.9034722222222222 | 0 |
| 0.9041666666666667 | 0 |
| 0.904861111111111 | 0 |
| 0.9055555555555556 | 0 |
| 0.90625 | 0 |
| 0.9069444444444444 | 0 |
| 0.907638888888889 | 0 |
| 0.9083333333333333 | 0 |
| 0.9090277777777778 | 0 |
| 0.9097222222222222 | 0 |
| 0.9104166666666668 | 0 |
| 0.9111111111111111 | 0 |
| 0.9118055555555555 | 0 |
| 0.9125 | 0 |
| 0.9131944444444445 | 0 |
| 0.9138888888888889 | 0 |
| 0.9145833333333333 | 0 |
| 0.9152777777777777 | 0 |
| 0.9159722222222223 | 0 |
| 0.9166666666666666 | 0 |
| 0.9173611111111111 | 0 |
| 0.9180555555555556 | 0 |
| 0.9187500000000001 | 0 |
| 0.9194444444444444 | 0 |
| 0.9201388888888888 | 0 |
| 0.9208333333333334 | 0 |
| 0.9215277777777778 | 0 |
| 0.9222222222222222 | 0 |
| 0.9229166666666666 | 0 |
| 0.9236111111111112 | 0 |
| 0.9243055555555556 | 0 |
| 0.9249999999999999 | 0 |
| 0.9256944444444444 | 0 |
| 0.9263888888888889 | 0 |
| 0.9270833333333334 | 0 |
| 0.9277777777777777 | 0 |
| 0.9284722222222223 | 0 |
| 0.9291666666666667 | 0 |
| 0.9298611111111111 | 0 |
| 0.9305555555555555 | 0 |
| 0.93125 | 0 |
| 0.9319444444444445 | 0 |
| 0.9326388888888889 | 0 |
| 0.9333333333333332 | 0 |
| 0.9340277777777778 | 0 |
| 0.9347222222222222 | 0 |
| 0.9354166666666667 | 0 |
| 0.936111111111111 | 0 |
| 0.9368055555555556 | 0 |
| 0.9375 | 0 |
| 0.9381944444444444 | 0 |
| 0.938888888888889 | 0 |
| 0.9395833333333333 | 0 |
| 0.9402777777777778 | 0 |
| 0.9409722222222222 | 0 |
| 0.9416666666666668 | 0 |
| 0.9423611111111111 | 0 |
| 0.9430555555555555 | 0 |
| 0.94375 | 0 |
| 0.9444444444444445 | 0 |
| 0.9451388888888889 | 0 |
| 0.9458333333333333 | 0 |
| 0.9465277777777777 | 0 |
| 0.9472222222222223 | 0 |
| 0.9479166666666666 | 0 |
| 0.9486111111111111 | 0 |
| 0.9493055555555556 | 0 |
| 0.9500000000000001 | 0 |
| 0.9506944444444444 | 0 |
| 0.9513888888888888 | 0 |
| 0.9520833333333334 | 0 |
| 0.9527777777777778 | 0 |
| 0.9534722222222222 | 0 |
| 0.9541666666666666 | 0 |
| 0.9548611111111112 | 0 |
| 0.9555555555555556 | 0 |
| 0.9562499999999999 | 0 |
| 0.9569444444444444 | 0 |
| 0.9576388888888889 | 0 |
| 0.9583333333333334 | 0 |
| 0.9590277777777777 | 0 |
| 0.9597222222222223 | 0 |
| 0.9604166666666667 | 0 |
| 0.9611111111111111 | 0 |
| 0.9618055555555555 | 0 |
| 0.9625 | 0 |
| 0.9631944444444445 | 0 |
| 0.9638888888888889 | 0 |
| 0.9645833333333332 | 0 |
| 0.9652777777777778 | 0 |
| 0.9659722222222222 | 0 |
| 0.9666666666666667 | 0 |
| 0.967361111111111 | 0 |
| 0.9680555555555556 | 0 |
| 0.96875 | 0 |
| 0.9694444444444444 | 0 |
| 0.970138888888889 | 0 |
| 0.9708333333333333 | 0 |
| 0.9715277777777778 | 0 |
| 0.9722222222222222 | 0 |
| 0.9729166666666668 | 0 |
| 0.9736111111111111 | 0 |
| 0.9743055555555555 | 0 |
| 0.975 | 0 |
| 0.9756944444444445 | 0 |
| 0.9763888888888889 | 0 |
| 0.9770833333333333 | 0 |
| 0.9777777777777777 | 0 |
| 0.9784722222222223 | 0 |
| 0.9791666666666666 | 0 |
| 0.9798611111111111 | 0 |
| 0.9805555555555556 | 0 |
| 0.9812500000000001 | 0 |
| 0.9819444444444444 | 0 |
| 0.9826388888888888 | 0 |
| 0.9833333333333334 | 0 |
| 0.9840277777777778 | 0 |
| 0.9847222222222222 | 0 |
| 0.9854166666666666 | 0 |
| 0.9861111111111112 | 0 |
| 0.9868055555555556 | 0 |
| 0.9874999999999999 | 0 |
| 0.9881944444444444 | 0 |
| 0.9888888888888889 | 0 |
| 0.9895833333333334 | 0 |
| 0.9902777777777777 | 0 |
| 0.9909722222222223 | 0 |
| 0.9916666666666667 | 0 |
| 0.9923611111111111 | 0 |
| 0.9930555555555555 | 0 |
| 0.99375 | 0 |
| 0.9944444444444445 | 0 |
| 0.9951388888888889 | 0 |
| 0.9958333333333332 | 0 |
| 0.9965277777777778 | 0 |
| 0.9972222222222222 | 0 |
| 0.9979166666666667 | 0 |
| 0.998611111111111 | 0 |
| 0.9993055555555556 | 0 |